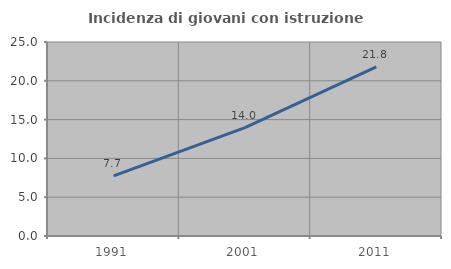
| Category | Incidenza di giovani con istruzione universitaria |
|---|---|
| 1991.0 | 7.737 |
| 2001.0 | 13.966 |
| 2011.0 | 21.789 |